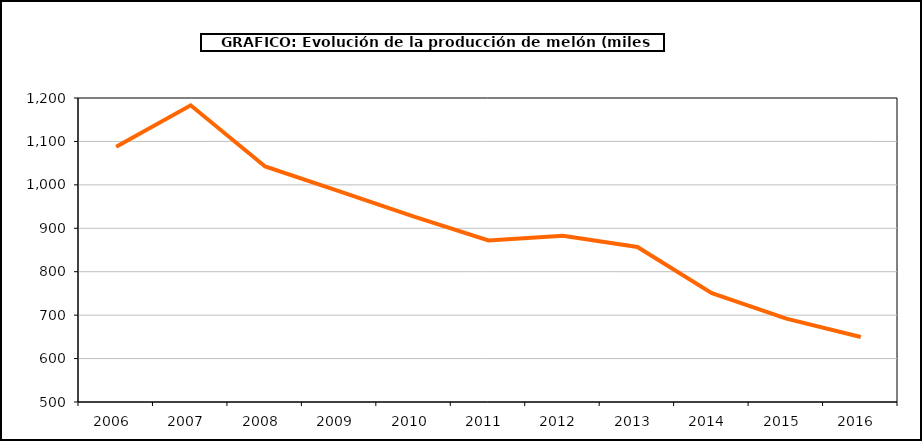
| Category | producción |
|---|---|
| 2006.0 | 1087.917 |
| 2007.0 | 1183.154 |
| 2008.0 | 1042.439 |
| 2009.0 | 984.786 |
| 2010.0 | 926.693 |
| 2011.0 | 871.996 |
| 2012.0 | 882.869 |
| 2013.0 | 856.951 |
| 2014.0 | 750.592 |
| 2015.0 | 692.056 |
| 2016.0 | 649.767 |